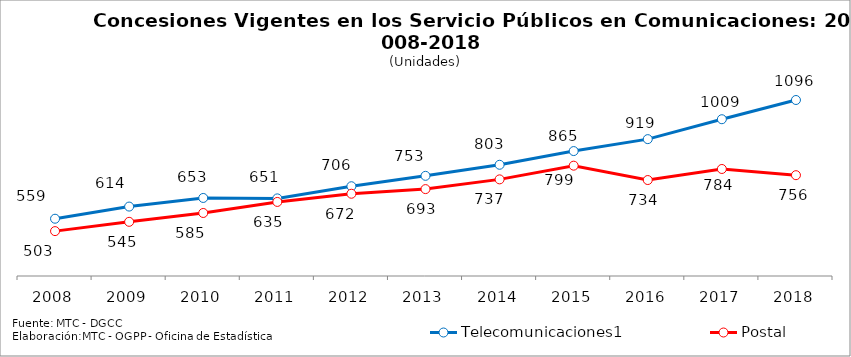
| Category | Telecomunicaciones1 | Postal |
|---|---|---|
| 2008.0 | 559 | 503 |
| 2009.0 | 614 | 545 |
| 2010.0 | 653 | 585 |
| 2011.0 | 651 | 635 |
| 2012.0 | 706 | 672 |
| 2013.0 | 753 | 693 |
| 2014.0 | 803 | 737 |
| 2015.0 | 865 | 799 |
| 2016.0 | 919 | 734 |
| 2017.0 | 1009 | 784 |
| 2018.0 | 1096 | 756 |